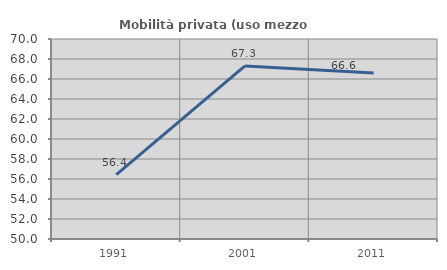
| Category | Mobilità privata (uso mezzo privato) |
|---|---|
| 1991.0 | 56.434 |
| 2001.0 | 67.304 |
| 2011.0 | 66.61 |